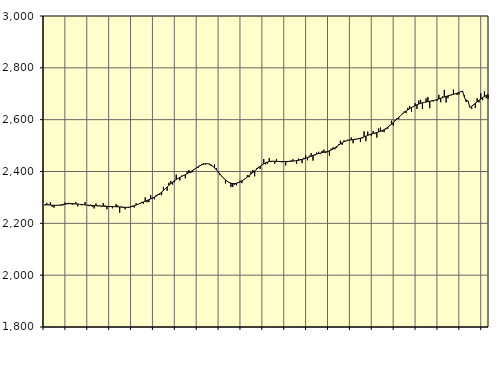
| Category | Piggar | Series 1 |
|---|---|---|
| nan | 2268.7 | 2272.54 |
| 1.0 | 2279 | 2271.78 |
| 1.0 | 2273.5 | 2271.15 |
| 1.0 | 2281 | 2270.57 |
| 1.0 | 2264 | 2270.02 |
| 1.0 | 2260.6 | 2269.6 |
| 1.0 | 2268.4 | 2269.51 |
| 1.0 | 2271 | 2269.7 |
| 1.0 | 2269.4 | 2270.38 |
| 1.0 | 2268.1 | 2271.44 |
| 1.0 | 2269.5 | 2272.73 |
| 1.0 | 2279.8 | 2274.01 |
| nan | 2277.8 | 2275.05 |
| 2.0 | 2279 | 2275.75 |
| 2.0 | 2278.4 | 2276 |
| 2.0 | 2271.7 | 2275.85 |
| 2.0 | 2274.1 | 2275.47 |
| 2.0 | 2281.9 | 2274.93 |
| 2.0 | 2265.6 | 2274.28 |
| 2.0 | 2273.3 | 2273.53 |
| 2.0 | 2269.8 | 2272.74 |
| 2.0 | 2271.6 | 2271.92 |
| 2.0 | 2281.9 | 2271.09 |
| 2.0 | 2270.6 | 2270.33 |
| nan | 2266.4 | 2269.64 |
| 3.0 | 2272.1 | 2269.05 |
| 3.0 | 2263.6 | 2268.6 |
| 3.0 | 2257.5 | 2268.25 |
| 3.0 | 2276.5 | 2267.9 |
| 3.0 | 2266.1 | 2267.48 |
| 3.0 | 2269.2 | 2267 |
| 3.0 | 2263.5 | 2266.52 |
| 3.0 | 2278.2 | 2266.05 |
| 3.0 | 2268.9 | 2265.66 |
| 3.0 | 2254.6 | 2265.32 |
| 3.0 | 2263 | 2265.02 |
| nan | 2263.6 | 2264.79 |
| 4.0 | 2258 | 2264.57 |
| 4.0 | 2263.8 | 2264.34 |
| 4.0 | 2274.2 | 2264.06 |
| 4.0 | 2269 | 2263.67 |
| 4.0 | 2241.5 | 2263.13 |
| 4.0 | 2266 | 2262.54 |
| 4.0 | 2259 | 2262.04 |
| 4.0 | 2253.9 | 2261.7 |
| 4.0 | 2261.2 | 2261.69 |
| 4.0 | 2259.3 | 2262.3 |
| 4.0 | 2265.3 | 2263.55 |
| nan | 2268.4 | 2265.41 |
| 5.0 | 2261 | 2267.84 |
| 5.0 | 2277.7 | 2270.65 |
| 5.0 | 2273.3 | 2273.62 |
| 5.0 | 2277.8 | 2276.58 |
| 5.0 | 2282.9 | 2279.56 |
| 5.0 | 2275.3 | 2282.45 |
| 5.0 | 2300.1 | 2285.24 |
| 5.0 | 2281 | 2288.11 |
| 5.0 | 2281.8 | 2291.06 |
| 5.0 | 2309.1 | 2294.1 |
| 5.0 | 2295.4 | 2297.39 |
| nan | 2293.1 | 2301.07 |
| 6.0 | 2309.4 | 2305.17 |
| 6.0 | 2312.9 | 2309.77 |
| 6.0 | 2310 | 2314.94 |
| 6.0 | 2308.8 | 2320.69 |
| 6.0 | 2340.7 | 2326.92 |
| 6.0 | 2333.2 | 2333.53 |
| 6.0 | 2325.4 | 2340.28 |
| 6.0 | 2356.5 | 2346.84 |
| 6.0 | 2363.6 | 2353.11 |
| 6.0 | 2349.7 | 2358.94 |
| 6.0 | 2358.2 | 2364.21 |
| nan | 2387.9 | 2368.99 |
| 7.0 | 2373.7 | 2373.31 |
| 7.0 | 2365.1 | 2377.2 |
| 7.0 | 2384.3 | 2380.8 |
| 7.0 | 2386.8 | 2384.3 |
| 7.0 | 2373.5 | 2387.82 |
| 7.0 | 2399.7 | 2391.49 |
| 7.0 | 2405.1 | 2395.47 |
| 7.0 | 2394.7 | 2399.8 |
| 7.0 | 2397.6 | 2404.35 |
| 7.0 | 2407.9 | 2409 |
| 7.0 | 2413.2 | 2413.63 |
| nan | 2413.9 | 2418.02 |
| 8.0 | 2425 | 2421.99 |
| 8.0 | 2429.5 | 2425.43 |
| 8.0 | 2431.2 | 2428.1 |
| 8.0 | 2427.6 | 2429.7 |
| 8.0 | 2429.2 | 2429.96 |
| 8.0 | 2430.1 | 2428.63 |
| 8.0 | 2422.3 | 2425.5 |
| 8.0 | 2421.1 | 2420.62 |
| 8.0 | 2427.3 | 2414.31 |
| 8.0 | 2413.2 | 2406.92 |
| 8.0 | 2396.6 | 2398.81 |
| nan | 2385.9 | 2390.39 |
| 9.0 | 2380.7 | 2382.12 |
| 9.0 | 2373.2 | 2374.38 |
| 9.0 | 2353.8 | 2367.55 |
| 9.0 | 2360.8 | 2361.89 |
| 9.0 | 2355.4 | 2357.64 |
| 9.0 | 2340 | 2354.82 |
| 9.0 | 2340.1 | 2353.39 |
| 9.0 | 2348 | 2353.35 |
| 9.0 | 2346.3 | 2354.52 |
| 9.0 | 2359.1 | 2356.71 |
| 9.0 | 2364.5 | 2359.84 |
| nan | 2355.1 | 2363.81 |
| 10.0 | 2370.4 | 2368.35 |
| 10.0 | 2373.9 | 2373.35 |
| 10.0 | 2385.7 | 2378.78 |
| 10.0 | 2378 | 2384.47 |
| 10.0 | 2397.6 | 2390.29 |
| 10.0 | 2405.8 | 2396.22 |
| 10.0 | 2381.5 | 2402.22 |
| 10.0 | 2411.8 | 2408.21 |
| 10.0 | 2417.8 | 2414.11 |
| 10.0 | 2409.7 | 2419.73 |
| 10.0 | 2425.8 | 2424.89 |
| nan | 2447.9 | 2429.45 |
| 11.0 | 2427.5 | 2433.25 |
| 11.0 | 2430 | 2436.17 |
| 11.0 | 2451.7 | 2438.18 |
| 11.0 | 2436.3 | 2439.32 |
| 11.0 | 2438.2 | 2439.72 |
| 11.0 | 2429.8 | 2439.55 |
| 11.0 | 2448.6 | 2439.19 |
| 11.0 | 2438.3 | 2438.84 |
| 11.0 | 2436.6 | 2438.54 |
| 11.0 | 2435.5 | 2438.44 |
| 11.0 | 2437.9 | 2438.54 |
| nan | 2423.5 | 2438.66 |
| 12.0 | 2436.3 | 2438.86 |
| 12.0 | 2436.6 | 2439.18 |
| 12.0 | 2442.6 | 2439.55 |
| 12.0 | 2447.1 | 2440.07 |
| 12.0 | 2441.1 | 2440.89 |
| 12.0 | 2429.9 | 2441.98 |
| 12.0 | 2449.4 | 2443.28 |
| 12.0 | 2448.3 | 2444.78 |
| 12.0 | 2432.6 | 2446.52 |
| 12.0 | 2453 | 2448.49 |
| 12.0 | 2461.9 | 2450.74 |
| nan | 2443.2 | 2453.26 |
| 13.0 | 2461.1 | 2456.11 |
| 13.0 | 2470.6 | 2459.13 |
| 13.0 | 2442.1 | 2462.08 |
| 13.0 | 2461.9 | 2464.82 |
| 13.0 | 2472.9 | 2467.27 |
| 13.0 | 2476 | 2469.42 |
| 13.0 | 2467.6 | 2471.21 |
| 13.0 | 2479.6 | 2472.73 |
| 13.0 | 2484.4 | 2474.17 |
| 13.0 | 2470.9 | 2475.75 |
| 13.0 | 2475 | 2477.61 |
| nan | 2461 | 2479.96 |
| 14.0 | 2488.3 | 2482.97 |
| 14.0 | 2492.8 | 2486.72 |
| 14.0 | 2485.7 | 2491.22 |
| 14.0 | 2491.1 | 2496.3 |
| 14.0 | 2504 | 2501.53 |
| 14.0 | 2518.9 | 2506.59 |
| 14.0 | 2502.5 | 2511.18 |
| 14.0 | 2520.3 | 2514.94 |
| 14.0 | 2516.8 | 2517.8 |
| 14.0 | 2522.6 | 2519.79 |
| 14.0 | 2522.7 | 2521.12 |
| nan | 2531.4 | 2522.08 |
| 15.0 | 2509 | 2522.88 |
| 15.0 | 2525.8 | 2523.72 |
| 15.0 | 2526.4 | 2524.94 |
| 15.0 | 2528.4 | 2526.62 |
| 15.0 | 2514.1 | 2528.66 |
| 15.0 | 2527.8 | 2530.98 |
| 15.0 | 2554.8 | 2533.59 |
| 15.0 | 2516.9 | 2536.42 |
| 15.0 | 2553.8 | 2539.3 |
| 15.0 | 2544 | 2542.04 |
| 15.0 | 2537.4 | 2544.45 |
| nan | 2556.5 | 2546.58 |
| 16.0 | 2546 | 2548.53 |
| 16.0 | 2530.8 | 2550.49 |
| 16.0 | 2566 | 2552.6 |
| 16.0 | 2569.8 | 2555.1 |
| 16.0 | 2553.2 | 2558.13 |
| 16.0 | 2551.8 | 2561.8 |
| 16.0 | 2562.6 | 2566.1 |
| 16.0 | 2565.1 | 2570.98 |
| 16.0 | 2579.2 | 2576.44 |
| 16.0 | 2596.1 | 2582.39 |
| 16.0 | 2577.3 | 2588.82 |
| nan | 2599.6 | 2595.53 |
| 17.0 | 2604.7 | 2602.39 |
| 17.0 | 2603 | 2609.2 |
| 17.0 | 2616.2 | 2615.68 |
| 17.0 | 2623.8 | 2621.75 |
| 17.0 | 2631.8 | 2627.46 |
| 17.0 | 2625.3 | 2632.84 |
| 17.0 | 2645.6 | 2637.77 |
| 17.0 | 2652.8 | 2642.37 |
| 17.0 | 2630.8 | 2646.67 |
| 17.0 | 2648.8 | 2650.64 |
| 17.0 | 2663.4 | 2654.27 |
| nan | 2641.5 | 2657.59 |
| 18.0 | 2673.9 | 2660.45 |
| 18.0 | 2676.6 | 2662.92 |
| 18.0 | 2641 | 2665.01 |
| 18.0 | 2667.2 | 2666.62 |
| 18.0 | 2682 | 2667.96 |
| 18.0 | 2687.6 | 2669.25 |
| 18.0 | 2644.1 | 2670.64 |
| 18.0 | 2673.5 | 2672.14 |
| 18.0 | 2670.3 | 2673.77 |
| 18.0 | 2676.2 | 2675.63 |
| 18.0 | 2672.9 | 2677.7 |
| nan | 2695.7 | 2680.01 |
| 19.0 | 2667.4 | 2682.5 |
| 19.0 | 2689.3 | 2685 |
| 19.0 | 2715.3 | 2687.46 |
| 19.0 | 2666.2 | 2689.8 |
| 19.0 | 2682.8 | 2691.86 |
| 19.0 | 2693.3 | 2693.69 |
| 19.0 | 2698.3 | 2695.55 |
| 19.0 | 2715.8 | 2697.63 |
| 19.0 | 2698.7 | 2699.92 |
| 19.0 | 2695 | 2702.35 |
| 19.0 | 2697.4 | 2704.9 |
| nan | 2708.5 | 2707.45 |
| 20.0 | 2706.6 | 2710.09 |
| 20.0 | 2694 | 2687.78 |
| 20.0 | 2676.8 | 2669.84 |
| 20.0 | 2673.8 | 2673.61 |
| 20.0 | 2647.2 | 2646.71 |
| 20.0 | 2640.9 | 2651.87 |
| 20.0 | 2660 | 2657.43 |
| 20.0 | 2644.7 | 2663.16 |
| 20.0 | 2682.9 | 2668.88 |
| 20.0 | 2666.4 | 2674.57 |
| 20.0 | 2701.8 | 2680.04 |
| nan | 2675.1 | 2685.09 |
| 21.0 | 2709.2 | 2689.6 |
| 21.0 | 2682.6 | 2693.51 |
| 21.0 | 2680.8 | 2696.83 |